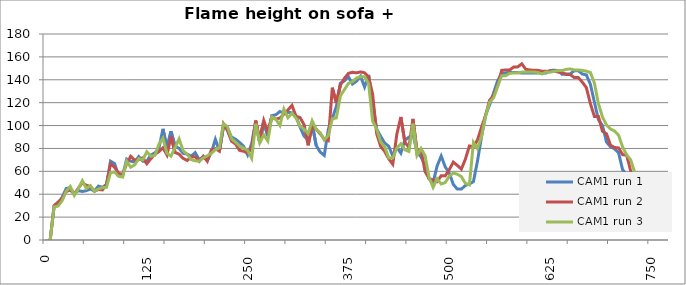
| Category | CAM1 run 1 | CAM1 run 2 | CAM1 run 3 |
|---|---|---|---|
| 0.0 | -1 | -1 | -1 |
| 5.0 | -1 | -1 | -1 |
| 10.0 | 28.988 | 30.147 | 28.928 |
| 15.0 | 31.886 | 33.088 | 29.642 |
| 20.0 | 37.326 | 36.397 | 34.284 |
| 25.0 | 44.951 | 42.279 | 42.533 |
| 30.0 | 45.665 | 43.75 | 46.815 |
| 35.0 | 40.219 | 40.075 | 38.951 |
| 40.0 | 43.117 | 45.222 | 44.661 |
| 45.0 | 42.397 | 50.022 | 51.8 |
| 50.0 | 43.116 | 47.807 | 45.008 |
| 55.0 | 44.565 | 46.697 | 47.507 |
| 60.0 | 42.754 | 42.653 | 42.497 |
| 65.0 | 47.101 | 44.131 | 44.64 |
| 70.0 | 46.014 | 43.775 | 45.71 |
| 75.0 | 48.556 | 48.552 | 46.067 |
| 80.0 | 68.875 | 66.548 | 58.94 |
| 85.0 | 66.702 | 63.603 | 59.281 |
| 90.0 | 56.254 | 58.089 | 55.71 |
| 95.0 | 55.892 | 57.354 | 54.996 |
| 100.0 | 70.727 | 66.548 | 68.93 |
| 105.0 | 68.875 | 73.165 | 63.574 |
| 110.0 | 68.178 | 69.862 | 65.711 |
| 115.0 | 72.884 | 70.222 | 71.079 |
| 120.0 | 68.887 | 71.805 | 70.007 |
| 125.0 | 68.875 | 66.626 | 77.136 |
| 130.0 | 74.297 | 71.071 | 73.208 |
| 135.0 | 76.109 | 74.894 | 73.922 |
| 140.0 | 80.093 | 77.237 | 83.639 |
| 145.0 | 97.112 | 80.599 | 88.978 |
| 150.0 | 80.455 | 74.309 | 75.791 |
| 155.0 | 95.011 | 90.478 | 73.294 |
| 160.0 | 81.923 | 76.485 | 80.785 |
| 165.0 | 80.102 | 75.014 | 88.39 |
| 170.0 | 75.756 | 71.339 | 78.033 |
| 175.0 | 75.031 | 69.501 | 74.827 |
| 180.0 | 73.221 | 72.441 | 70.256 |
| 185.0 | 76.336 | 72.802 | 69.188 |
| 190.0 | 70.198 | 68.751 | 68.833 |
| 195.0 | 72.725 | 73.165 | 71.71 |
| 200.0 | 69.806 | 68.751 | 73.59 |
| 205.0 | 76.431 | 78.719 | 75.687 |
| 210.0 | 87.951 | 79.801 | 78.856 |
| 215.0 | 77.449 | 77.581 | 80.635 |
| 220.0 | 98.993 | 101.471 | 101.695 |
| 225.0 | 97.545 | 95.589 | 98.971 |
| 230.0 | 89.928 | 86.398 | 88.598 |
| 235.0 | 88.118 | 83.824 | 85.385 |
| 240.0 | 85.222 | 78.31 | 82.173 |
| 245.0 | 81.964 | 77.574 | 80.388 |
| 250.0 | 74.364 | 76.104 | 78.246 |
| 255.0 | 84.233 | 80.15 | 71.465 |
| 260.0 | 103.747 | 104.428 | 101.541 |
| 265.0 | 84.913 | 87.512 | 84.743 |
| 270.0 | 103.042 | 104.412 | 91.86 |
| 275.0 | 90.789 | 94.488 | 86.509 |
| 280.0 | 108.711 | 107.721 | 107.75 |
| 285.0 | 109.404 | 105.515 | 105.449 |
| 290.0 | 112.294 | 106.618 | 100.098 |
| 295.0 | 110.821 | 109.927 | 114.368 |
| 300.0 | 111.544 | 113.604 | 106.847 |
| 305.0 | 111.156 | 117.647 | 110.773 |
| 310.0 | 108.239 | 108.091 | 106.49 |
| 315.0 | 98.721 | 106.988 | 99.353 |
| 320.0 | 90.743 | 100.738 | 96.856 |
| 325.0 | 87.446 | 82.724 | 92.931 |
| 330.0 | 101.559 | 99.676 | 104.095 |
| 335.0 | 82.648 | 96.792 | 96.61 |
| 340.0 | 76.853 | 92.72 | 93.759 |
| 345.0 | 73.957 | 88.312 | 87.398 |
| 350.0 | 96.42 | 86.815 | 91.315 |
| 355.0 | 106.199 | 133.093 | 105.921 |
| 360.0 | 116.694 | 119.889 | 106.657 |
| 365.0 | 136.961 | 135.335 | 125.884 |
| 370.0 | 139.135 | 141.207 | 131.338 |
| 375.0 | 142.758 | 145.618 | 136.863 |
| 380.0 | 136.249 | 146.508 | 138.346 |
| 385.0 | 138.785 | 146.047 | 141.491 |
| 390.0 | 143.127 | 146.857 | 142.646 |
| 395.0 | 133.7 | 146.141 | 142.646 |
| 400.0 | 144.207 | 142.469 | 136.598 |
| 405.0 | 119.994 | 127.418 | 103.798 |
| 410.0 | 96.984 | 92.893 | 97.005 |
| 415.0 | 90.48 | 81.733 | 85.601 |
| 420.0 | 84.731 | 77.37 | 81.506 |
| 425.0 | 81.843 | 70.876 | 71.625 |
| 430.0 | 73.433 | 66.197 | 71.665 |
| 435.0 | 80.943 | 92.446 | 80.336 |
| 440.0 | 75.905 | 107.494 | 84.087 |
| 445.0 | 87.289 | 85.384 | 78.846 |
| 450.0 | 89.816 | 80.997 | 77.379 |
| 455.0 | 92.286 | 105.797 | 101.705 |
| 460.0 | 76.915 | 77.825 | 73.936 |
| 465.0 | 72.573 | 78.924 | 79.951 |
| 470.0 | 65.339 | 59.782 | 73.793 |
| 475.0 | 53.374 | 53.718 | 54.657 |
| 480.0 | 50.168 | 52.44 | 45.961 |
| 485.0 | 64.717 | 51.008 | 53.467 |
| 490.0 | 73.343 | 56.107 | 48.944 |
| 495.0 | 63.951 | 56.028 | 50.201 |
| 500.0 | 58.567 | 61.431 | 55.673 |
| 505.0 | 48.613 | 68.069 | 58.524 |
| 510.0 | 44.465 | 65.18 | 57.499 |
| 515.0 | 44.465 | 61.936 | 55.453 |
| 520.0 | 47.634 | 70.601 | 49.487 |
| 525.0 | 48.967 | 82.206 | 48.15 |
| 530.0 | 51.019 | 81.479 | 85.313 |
| 535.0 | 68.978 | 87.405 | 79.871 |
| 540.0 | 90.026 | 98.476 | 90.625 |
| 545.0 | 108.952 | 108.68 | 108.071 |
| 550.0 | 118.036 | 122.097 | 120.391 |
| 555.0 | 128.637 | 126.207 | 124.317 |
| 560.0 | 139.089 | 134.559 | 134.278 |
| 565.0 | 145.58 | 148.245 | 143.577 |
| 570.0 | 145.907 | 148.606 | 143.577 |
| 575.0 | 146.629 | 148.606 | 145.602 |
| 580.0 | 146.268 | 151.198 | 145.952 |
| 585.0 | 146.268 | 151.271 | 146.022 |
| 590.0 | 145.907 | 153.965 | 146.731 |
| 595.0 | 145.907 | 149.083 | 146.731 |
| 600.0 | 145.907 | 148.599 | 146.805 |
| 605.0 | 145.907 | 148.233 | 146.805 |
| 610.0 | 145.907 | 148.233 | 146.381 |
| 615.0 | 145.907 | 147.5 | 145.114 |
| 620.0 | 145.907 | 147.5 | 146.722 |
| 625.0 | 148.04 | 147.5 | 146.653 |
| 630.0 | 148.4 | 147.5 | 147.354 |
| 635.0 | 148.04 | 146.739 | 148.055 |
| 640.0 | 144.728 | 146.372 | 148.055 |
| 645.0 | 145.089 | 144.539 | 149.107 |
| 650.0 | 145.089 | 144.539 | 149.457 |
| 655.0 | 147.977 | 141.973 | 148.622 |
| 660.0 | 147.977 | 141.973 | 148.622 |
| 665.0 | 145.029 | 137.942 | 148.206 |
| 670.0 | 144.278 | 133.178 | 147.504 |
| 675.0 | 136.171 | 119.261 | 146.385 |
| 680.0 | 120.429 | 107.918 | 137.13 |
| 685.0 | 105.078 | 107.918 | 119.075 |
| 690.0 | 100.042 | 95.005 | 107.494 |
| 695.0 | 85.658 | 92.773 | 100.511 |
| 700.0 | 81.393 | 82.714 | 96.966 |
| 705.0 | 79.615 | 80.85 | 95.321 |
| 710.0 | 76.143 | 80.451 | 91.499 |
| 715.0 | 61.299 | 74.527 | 81.264 |
| 720.0 | 57.344 | 74.161 | 74.446 |
| 725.0 | 56.625 | 60.214 | 70.067 |
| 730.0 | 49.447 | 48.52 | 59.031 |
| 735.0 | 47.656 | 47.79 | 56.892 |
| 740.0 | 41.222 | 47.425 | 52.616 |
| 745.0 | 38.372 | 46.651 | 46.205 |
| 750.0 | 35.251 | 41.778 | 40.899 |
| 755.0 | 34.898 | 40.277 | 40.899 |
| 760.0 | 31.723 | 37.68 | 35.571 |
| 765.0 | 31.723 | 37.68 | 34.861 |
| 770.0 | 30.761 | 35.783 | 34.507 |